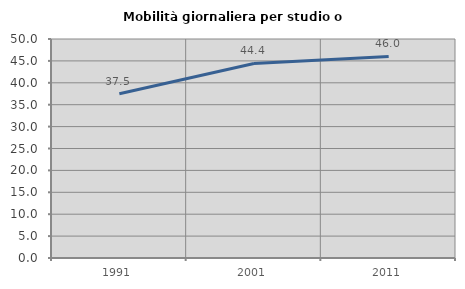
| Category | Mobilità giornaliera per studio o lavoro |
|---|---|
| 1991.0 | 37.518 |
| 2001.0 | 44.422 |
| 2011.0 | 46.015 |